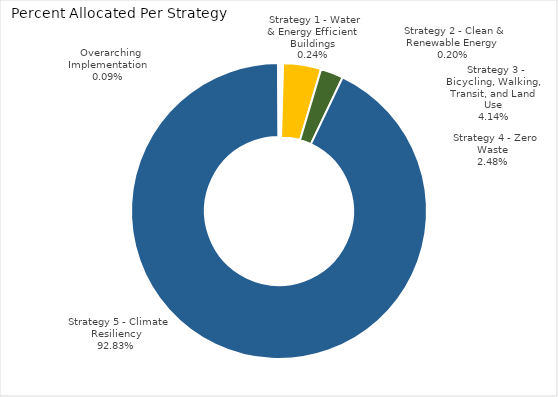
| Category | Percent |
|---|---|
|   Strategy 1 - Water & Energy Efficient Buildings | 0.002 |
|   Strategy 2 - Clean & Renewable Energy | 0.002 |
|   Strategy 3 - Bicycling, Walking, Transit, and Land Use | 0.041 |
|   Strategy 4 - Zero Waste | 0.025 |
|   Strategy 5 - Climate Resiliency | 0.928 |
|   Overarching Implementation | 0.001 |